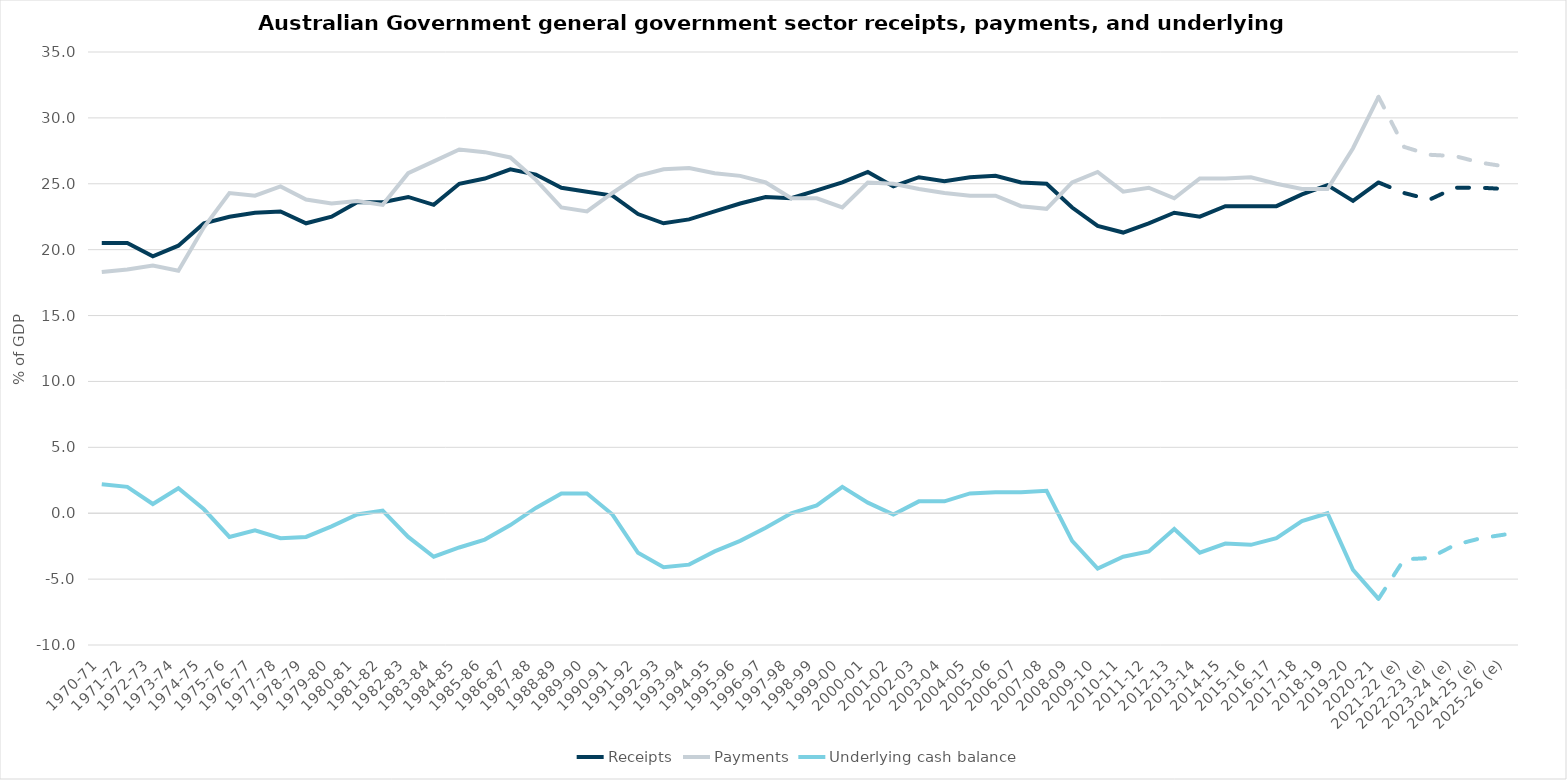
| Category | Receipts | Payments | Underlying cash balance |
|---|---|---|---|
| 1970-71 | 20.5 | 18.3 | 2.2 |
| 1971-72 | 20.5 | 18.5 | 2 |
| 1972-73 | 19.5 | 18.8 | 0.7 |
| 1973-74 | 20.3 | 18.4 | 1.9 |
| 1974-75 | 22 | 21.7 | 0.3 |
| 1975-76 | 22.5 | 24.3 | -1.8 |
| 1976-77 | 22.8 | 24.1 | -1.3 |
| 1977-78 | 22.9 | 24.8 | -1.9 |
| 1978-79 | 22 | 23.8 | -1.8 |
| 1979-80 | 22.5 | 23.5 | -1 |
| 1980-81 | 23.6 | 23.7 | -0.1 |
| 1981-82 | 23.6 | 23.4 | 0.2 |
| 1982-83 | 24 | 25.8 | -1.8 |
| 1983-84 | 23.4 | 26.7 | -3.3 |
| 1984-85 | 25 | 27.6 | -2.6 |
| 1985-86 | 25.4 | 27.4 | -2 |
| 1986-87 | 26.1 | 27 | -0.9 |
| 1987-88 | 25.7 | 25.3 | 0.4 |
| 1988-89 | 24.7 | 23.2 | 1.5 |
| 1989-90 | 24.4 | 22.9 | 1.5 |
| 1990-91 | 24.1 | 24.3 | -0.1 |
| 1991-92 | 22.7 | 25.6 | -3 |
| 1992-93 | 22 | 26.1 | -4.1 |
| 1993-94 | 22.3 | 26.2 | -3.9 |
| 1994-95 | 22.9 | 25.8 | -2.9 |
| 1995-96 | 23.5 | 25.6 | -2.1 |
| 1996-97 | 24 | 25.1 | -1.1 |
| 1997-98 | 23.9 | 23.9 | 0 |
| 1998-99 | 24.5 | 23.9 | 0.6 |
| 1999-00 | 25.1 | 23.2 | 2 |
| 2000-01 | 25.9 | 25.1 | 0.8 |
| 2001-02 | 24.8 | 25 | -0.1 |
| 2002-03 | 25.5 | 24.6 | 0.9 |
| 2003-04 | 25.2 | 24.3 | 0.9 |
| 2004-05 | 25.5 | 24.1 | 1.5 |
| 2005-06 | 25.6 | 24.1 | 1.6 |
| 2006-07 | 25.1 | 23.3 | 1.6 |
| 2007-08 | 25 | 23.1 | 1.7 |
| 2008-09 | 23.2 | 25.1 | -2.1 |
| 2009-10 | 21.8 | 25.9 | -4.2 |
| 2010-11 | 21.3 | 24.4 | -3.3 |
| 2011-12 | 22 | 24.7 | -2.9 |
| 2012-13 | 22.8 | 23.9 | -1.2 |
| 2013-14 | 22.5 | 25.4 | -3 |
| 2014-15 | 23.3 | 25.4 | -2.3 |
| 2015-16 | 23.3 | 25.5 | -2.4 |
| 2016-17 | 23.3 | 25 | -1.9 |
| 2017-18 | 24.2 | 24.6 | -0.6 |
| 2018-19 | 24.9 | 24.6 | 0 |
| 2019-20 | 23.7 | 27.7 | -4.3 |
| 2020-21 | 25.1 | 31.6 | -6.5 |
| 2021-22 (e) | 24.3 | 27.8 | -3.5 |
| 2022-23 (e) | 23.8 | 27.2 | -3.4 |
| 2023-24 (e) | 24.7 | 27.1 | -2.4 |
| 2024-25 (e) | 24.7 | 26.6 | -1.9 |
| 2025-26 (e) | 24.6 | 26.3 | -1.6 |